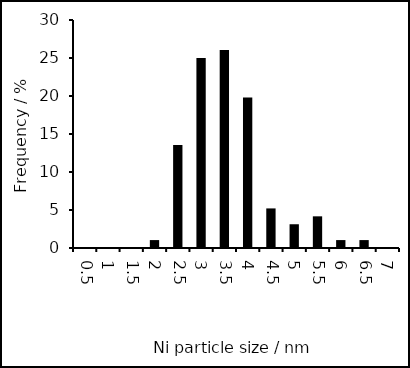
| Category | Series 0 |
|---|---|
| 0.5 | 0 |
| 1.0 | 0 |
| 1.5 | 0 |
| 2.0 | 1.042 |
| 2.5 | 13.542 |
| 3.0 | 25 |
| 3.5 | 26.042 |
| 4.0 | 19.792 |
| 4.5 | 5.208 |
| 5.0 | 3.125 |
| 5.5 | 4.167 |
| 6.0 | 1.042 |
| 6.5 | 1.042 |
| 7.0 | 0 |